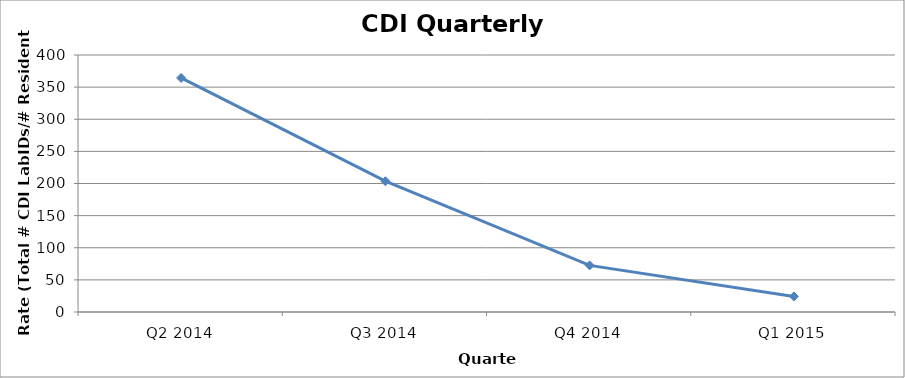
| Category | Series 0 |
|---|---|
| Q2 2014 | 364.322 |
| Q3 2014 | 203.593 |
| Q4 2014 | 72.551 |
| Q1 2015 | 24.155 |